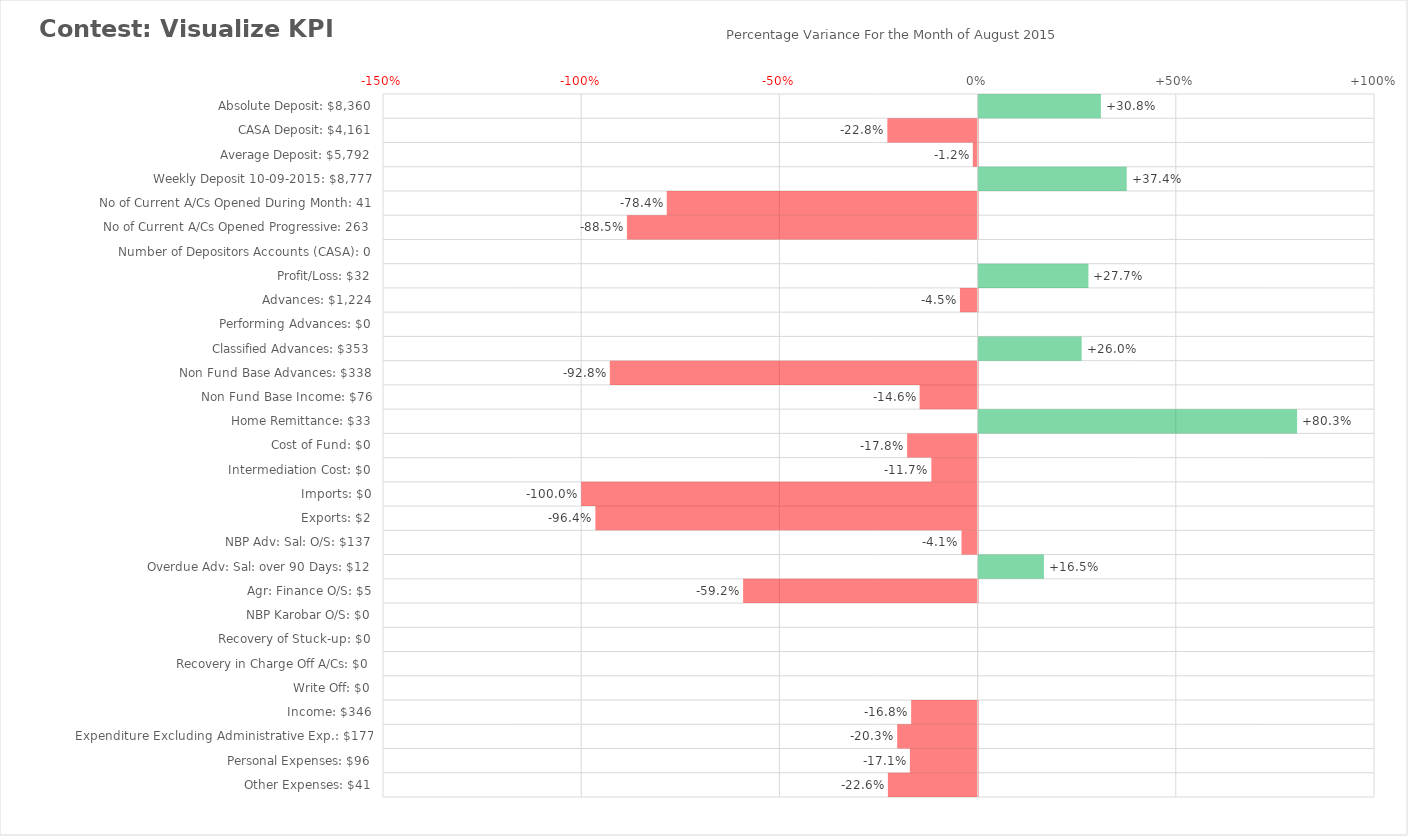
| Category | Variance with Base |
|---|---|
| Absolute Deposit: $8,360 | 0.308 |
| CASA Deposit: $4,161 | -0.228 |
| Average Deposit: $5,792 | -0.012 |
| Weekly Deposit 10-09-2015: $8,777 | 0.374 |
| No of Current A/Cs Opened During Month: 41 | -0.784 |
| No of Current A/Cs Opened Progressive: 263 | -0.885 |
| Number of Depositors Accounts (CASA): 0 | 0 |
| Profit/Loss: $32 | 0.277 |
| Advances: $1,224 | -0.045 |
| Performing Advances: $0 | 0 |
| Classified Advances: $353 | 0.26 |
| Non Fund Base Advances: $338 | -0.928 |
| Non Fund Base Income: $76 | -0.146 |
| Home Remittance: $33 | 0.803 |
| Cost of Fund: $0 | -0.178 |
| Intermediation Cost: $0 | -0.117 |
| Imports: $0 | -1 |
| Exports: $2 | -0.964 |
| NBP Adv: Sal: O/S: $137 | -0.041 |
| Overdue Adv: Sal: over 90 Days: $12 | 0.165 |
| Agr: Finance O/S: $5 | -0.592 |
| NBP Karobar O/S: $0 | 0 |
| Recovery of Stuck-up: $0 | 0 |
| Recovery in Charge Off A/Cs: $0 | 0 |
| Write Off: $0 | 0 |
| Income: $346 | -0.168 |
| Expenditure Excluding Administrative Exp.: $177 | -0.203 |
| Personal Expenses: $96 | -0.171 |
| Other Expenses: $41 | -0.226 |